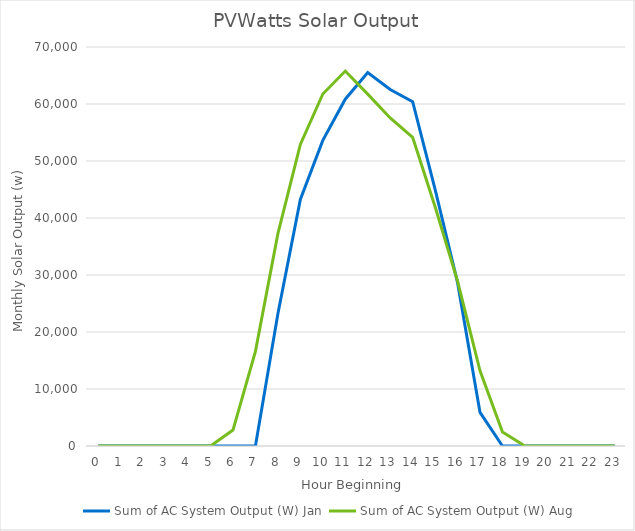
| Category | Sum of AC System Output (W) |
|---|---|
| 0.0 | 0 |
| 1.0 | 0 |
| 2.0 | 0 |
| 3.0 | 0 |
| 4.0 | 0 |
| 5.0 | 0 |
| 6.0 | 2798.376 |
| 7.0 | 16598.978 |
| 8.0 | 37254.89 |
| 9.0 | 52901.349 |
| 10.0 | 61751.859 |
| 11.0 | 65778.011 |
| 12.0 | 61739.352 |
| 13.0 | 57559.322 |
| 14.0 | 54141.724 |
| 15.0 | 41969.575 |
| 16.0 | 28942.373 |
| 17.0 | 13199.883 |
| 18.0 | 2442.167 |
| 19.0 | 0 |
| 20.0 | 0 |
| 21.0 | 0 |
| 22.0 | 0 |
| 23.0 | 0 |